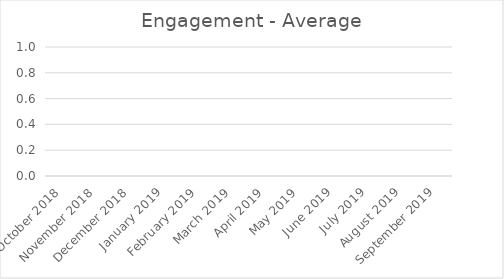
| Category | Average |
|---|---|
| October 2018 | 0 |
| November 2018 | 0 |
| December 2018 | 0 |
| January 2019 | 0 |
| February 2019 | 0 |
| March 2019 | 0 |
| April 2019 | 0 |
| May 2019 | 0 |
| June 2019 | 0 |
| July 2019 | 0 |
| August 2019 | 0 |
| September 2019 | 0 |